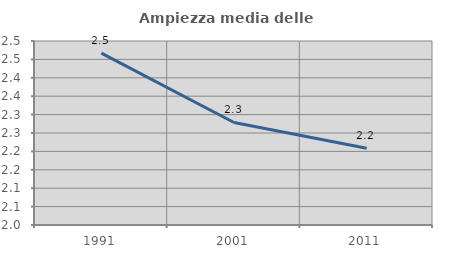
| Category | Ampiezza media delle famiglie |
|---|---|
| 1991.0 | 2.467 |
| 2001.0 | 2.279 |
| 2011.0 | 2.209 |